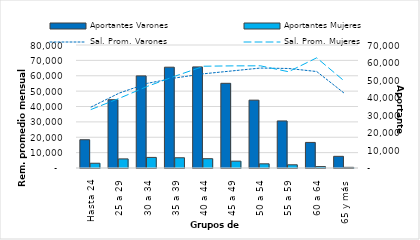
| Category | Aportantes Varones | Aportantes Mujeres |
|---|---|---|
| Hasta 24 | 16086 | 2710 |
| 25 a 29 | 38863 | 5184 |
| 30 a 34 | 52428 | 6026 |
| 35 a 39 | 57368 | 5828 |
| 40 a 44 | 57539 | 5297 |
| 45 a 49 | 48191 | 3898 |
| 50 a 54 | 38619 | 2382 |
| 55 a 59 | 26778 | 1825 |
| 60 a 64 | 14556 | 803 |
| 65 y más | 6641 | 381 |